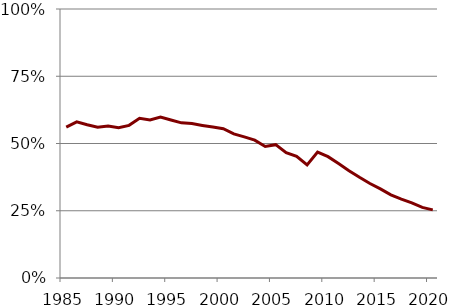
| Category | Series 1 |
|---|---|
| 1985.0 | 0.561 |
| 1986.0 | 0.581 |
| 1987.0 | 0.57 |
| 1988.0 | 0.56 |
| 1989.0 | 0.565 |
| 1990.0 | 0.559 |
| 1991.0 | 0.567 |
| 1992.0 | 0.594 |
| 1993.0 | 0.588 |
| 1994.0 | 0.598 |
| 1995.0 | 0.588 |
| 1996.0 | 0.577 |
| 1997.0 | 0.574 |
| 1998.0 | 0.567 |
| 1999.0 | 0.561 |
| 2000.0 | 0.555 |
| 2001.0 | 0.536 |
| 2002.0 | 0.525 |
| 2003.0 | 0.512 |
| 2004.0 | 0.489 |
| 2005.0 | 0.496 |
| 2006.0 | 0.466 |
| 2007.0 | 0.452 |
| 2008.0 | 0.42 |
| 2009.0 | 0.468 |
| 2010.0 | 0.451 |
| 2011.0 | 0.425 |
| 2012.0 | 0.399 |
| 2013.0 | 0.374 |
| 2014.0 | 0.351 |
| 2015.0 | 0.331 |
| 2016.0 | 0.309 |
| 2017.0 | 0.293 |
| 2018.0 | 0.279 |
| 2019.0 | 0.262 |
| 2020.0 | 0.253 |